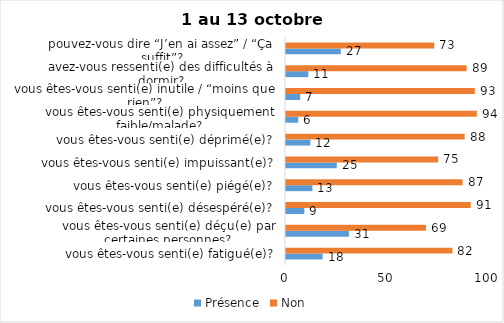
| Category | Présence | Non |
|---|---|---|
| vous êtes-vous senti(e) fatigué(e)? | 18 | 82 |
| vous êtes-vous senti(e) déçu(e) par certaines personnes? | 31 | 69 |
| vous êtes-vous senti(e) désespéré(e)? | 9 | 91 |
| vous êtes-vous senti(e) piégé(e)? | 13 | 87 |
| vous êtes-vous senti(e) impuissant(e)? | 25 | 75 |
| vous êtes-vous senti(e) déprimé(e)? | 12 | 88 |
| vous êtes-vous senti(e) physiquement faible/malade? | 6 | 94 |
| vous êtes-vous senti(e) inutile / “moins que rien”? | 7 | 93 |
| avez-vous ressenti(e) des difficultés à dormir? | 11 | 89 |
| pouvez-vous dire “J’en ai assez” / “Ça suffit”? | 27 | 73 |